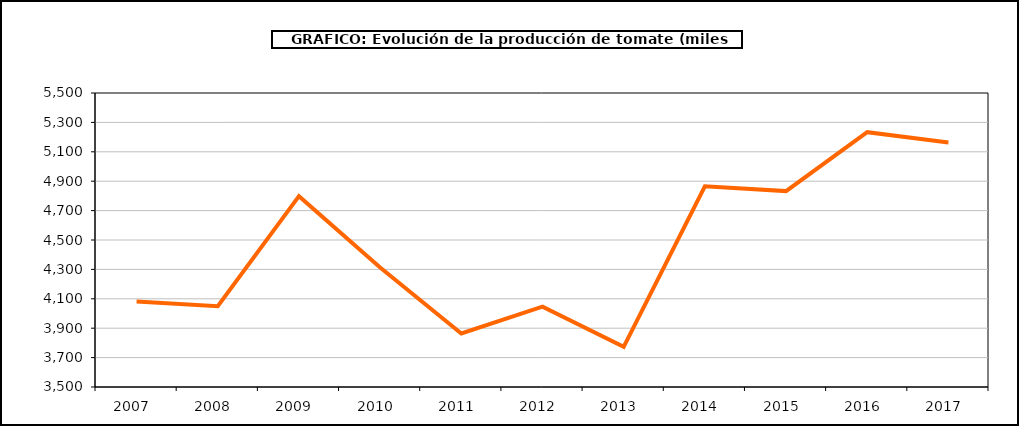
| Category | producción |
|---|---|
| 2007.0 | 4081.477 |
| 2008.0 | 4049.753 |
| 2009.0 | 4798.053 |
| 2010.0 | 4312.709 |
| 2011.0 | 3864.12 |
| 2012.0 | 4046.413 |
| 2013.0 | 3772.846 |
| 2014.0 | 4865.46 |
| 2015.0 | 4832.7 |
| 2016.0 | 5233.542 |
| 2017.0 | 5163.466 |